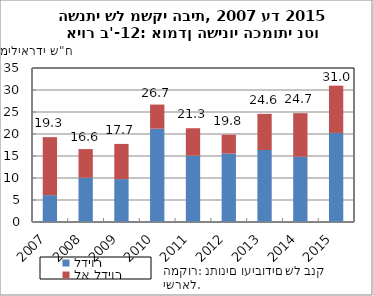
| Category | לדיור | לא לדיור |
|---|---|---|
| 2007-12-31 | 6.105 | 13.176 |
| 2008-12-31 | 10.061 | 6.51 |
| 2009-12-31 | 9.748 | 8 |
| 2010-12-31 | 21.206 | 5.48 |
| 2011-12-31 | 15.077 | 6.233 |
| 2012-12-31 | 15.555 | 4.283 |
| 2013-12-31 | 16.366 | 8.213 |
| 2014-12-31 | 14.838 | 9.895 |
| 2015-12-31 | 20.236 | 10.749 |